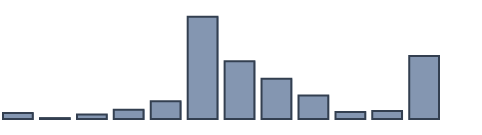
| Category | Series 0 |
|---|---|
| 0 | 1.775 |
| 1 | 0.265 |
| 2 | 1.332 |
| 3 | 2.728 |
| 4 | 5.188 |
| 5 | 30.09 |
| 6 | 16.949 |
| 7 | 11.867 |
| 8 | 6.914 |
| 9 | 2.045 |
| 10 | 2.32 |
| 11 | 18.525 |
| 12 | 0 |